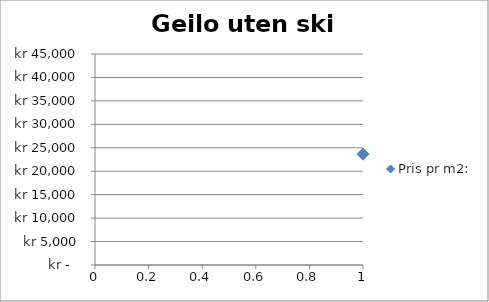
| Category | Pris pr m2: |
|---|---|
| 0 | 23636 |
| 1 | 17742 |
| 2 | 36066 |
| 3 | 29167 |
| 4 | 34259 |
| 5 | 32456 |
| 6 | 32456 |
| 7 | 32500 |
| 8 | 34000 |
| 9 | 33333 |
| 10 | 28261 |
| 11 | 29570 |
| 12 | 36400 |
| 13 | 29851 |
| 14 | 32500 |
| 15 | 37206 |
| 16 | 38070 |
| 17 | 21154 |
| 18 | 24603 |
| 19 | 17073 |
| 20 | 27027 |
| 21 | 37647 |
| 22 | 20000 |
| 23 | 30702 |
| 24 | 35185 |
| 25 | 37193 |
| 26 | 25000 |
| 27 | 27419 |
| 28 | 29412 |
| 29 | 36471 |
| 30 | 36328 |
| 31 | 32609 |
| 32 | 26667 |
| 33 | 38506 |
| 34 | 30435 |
| 35 | 36149 |
| 36 | 38529 |
| 37 | 21622 |
| 38 | 31250 |